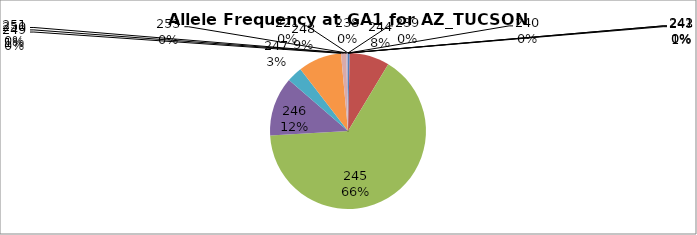
| Category | Series 0 |
|---|---|
| 221.0 | 0 |
| 238.0 | 0 |
| 239.0 | 0 |
| 240.0 | 0 |
| 241.0 | 0 |
| 242.0 | 0 |
| 243.0 | 0.004 |
| 244.0 | 0.083 |
| 245.0 | 0.655 |
| 246.0 | 0.122 |
| 247.0 | 0.032 |
| 248.0 | 0.09 |
| 249.0 | 0 |
| 250.0 | 0.011 |
| 251.0 | 0 |
| 253.0 | 0.004 |